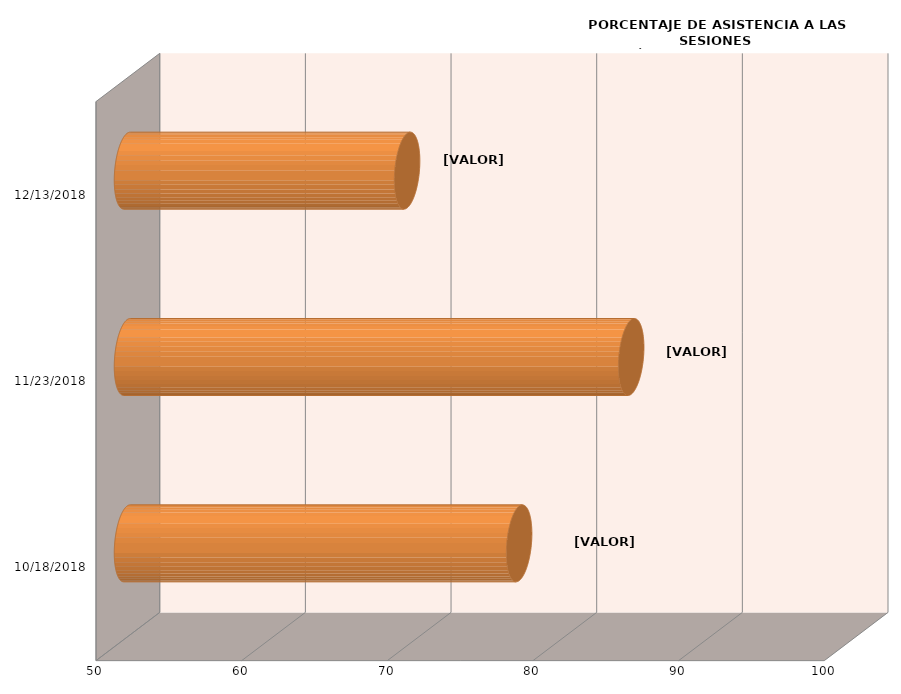
| Category | Series 0 |
|---|---|
| 10/18/18 | 76.923 |
| 11/23/18 | 84.615 |
| 12/13/18 | 69.231 |